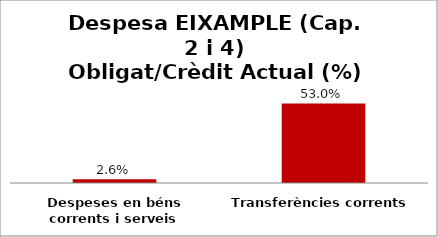
| Category | Series 0 |
|---|---|
| Despeses en béns corrents i serveis | 0.026 |
| Transferències corrents | 0.53 |